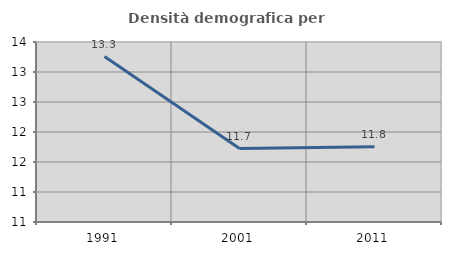
| Category | Densità demografica |
|---|---|
| 1991.0 | 13.257 |
| 2001.0 | 11.723 |
| 2011.0 | 11.753 |